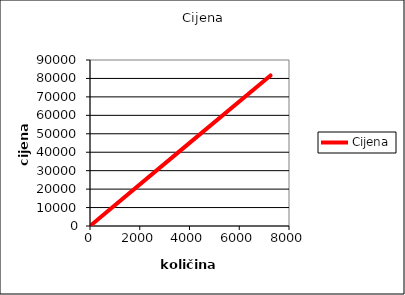
| Category | Cijena |
|---|---|
| 2.0 | 22.5 |
| 11.0 | 123.75 |
| 34.0 | 382.5 |
| 7257.0 | 81641.25 |
| 252.98 | 2846.025 |